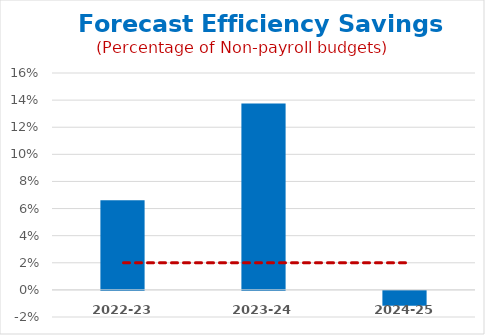
| Category | Forecast Efficiency Savings |
|---|---|
| 2022-23 | 0.066 |
| 2023-24 | 0.137 |
| 2024-25 | -0.011 |